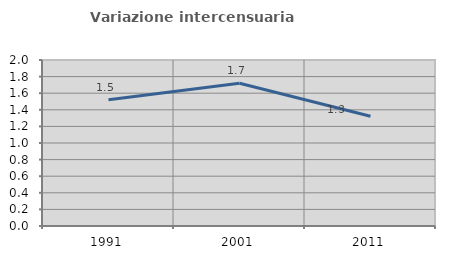
| Category | Variazione intercensuaria annua |
|---|---|
| 1991.0 | 1.521 |
| 2001.0 | 1.721 |
| 2011.0 | 1.321 |